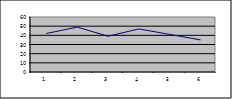
| Category | Series 0 |
|---|---|
| 0 | 42 |
| 1 | 49 |
| 2 | 39 |
| 3 | 47 |
| 4 | 41 |
| 5 | 35 |